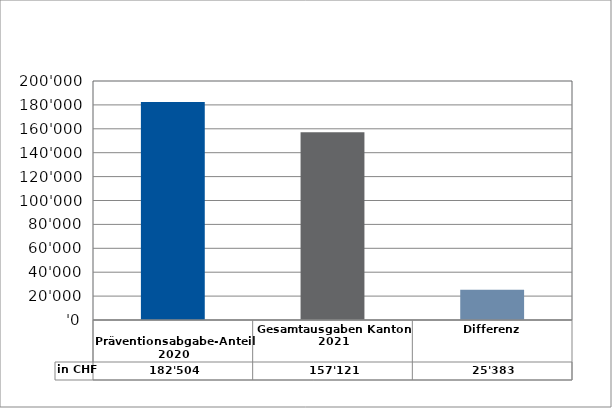
| Category | in CHF |
|---|---|
| 
Präventionsabgabe-Anteil 2020

 | 182504 |
| Gesamtausgaben Kanton 2021
 | 157121.05 |
| Differenz | 25382.95 |